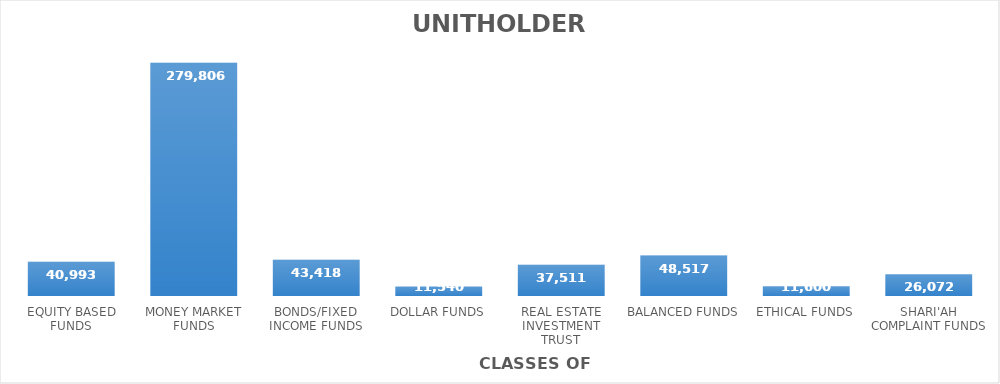
| Category | UNIT HOLDERS |
|---|---|
| EQUITY BASED FUNDS | 40993 |
| MONEY MARKET FUNDS | 279806 |
| BONDS/FIXED INCOME FUNDS | 43418 |
| DOLLAR FUNDS | 11540 |
| REAL ESTATE INVESTMENT TRUST | 37511 |
| BALANCED FUNDS | 48517 |
| ETHICAL FUNDS | 11600 |
| SHARI'AH COMPLAINT FUNDS | 26072 |